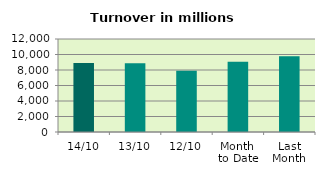
| Category | Series 0 |
|---|---|
| 14/10 | 8888.351 |
| 13/10 | 8864.508 |
| 12/10 | 7908.126 |
| Month 
to Date | 9066.986 |
| Last
Month | 9769.37 |